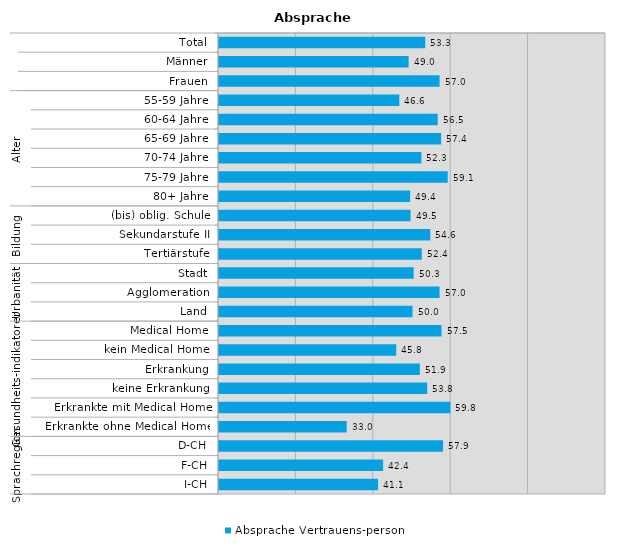
| Category | Absprache Vertrauens-person |
|---|---|
| 0 | 53.3 |
| 1 | 49 |
| 2 | 57 |
| 3 | 46.6 |
| 4 | 56.5 |
| 5 | 57.4 |
| 6 | 52.3 |
| 7 | 59.1 |
| 8 | 49.4 |
| 9 | 49.5 |
| 10 | 54.6 |
| 11 | 52.4 |
| 12 | 50.3 |
| 13 | 57 |
| 14 | 50 |
| 15 | 57.5 |
| 16 | 45.8 |
| 17 | 51.9 |
| 18 | 53.8 |
| 19 | 59.8 |
| 20 | 33 |
| 21 | 57.9 |
| 22 | 42.4 |
| 23 | 41.1 |